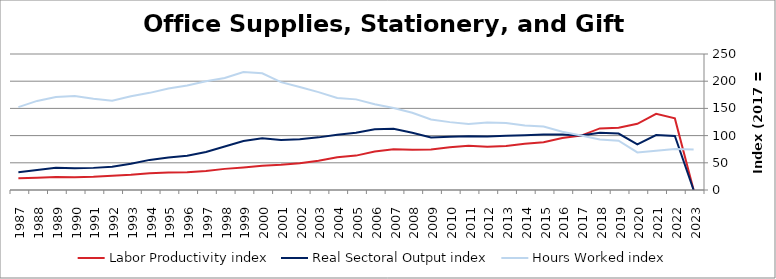
| Category | Labor Productivity index | Real Sectoral Output index | Hours Worked index |
|---|---|---|---|
| 2023.0 | 0 | 0 | 74.556 |
| 2022.0 | 131.637 | 99.237 | 75.387 |
| 2021.0 | 140.064 | 100.93 | 72.06 |
| 2020.0 | 121.677 | 83.976 | 69.015 |
| 2019.0 | 114.5 | 103.79 | 90.647 |
| 2018.0 | 113.265 | 105.143 | 92.829 |
| 2017.0 | 100 | 100 | 100 |
| 2016.0 | 95.387 | 102.232 | 107.176 |
| 2015.0 | 87.723 | 102.207 | 116.512 |
| 2014.0 | 85.18 | 100.848 | 118.394 |
| 2013.0 | 80.832 | 99.722 | 123.37 |
| 2012.0 | 79.314 | 98.306 | 123.944 |
| 2011.0 | 81.408 | 98.762 | 121.316 |
| 2010.0 | 78.515 | 97.969 | 124.777 |
| 2009.0 | 74.476 | 96.575 | 129.672 |
| 2008.0 | 74.041 | 105.225 | 142.116 |
| 2007.0 | 74.733 | 112.729 | 150.842 |
| 2006.0 | 70.94 | 111.759 | 157.539 |
| 2005.0 | 63.214 | 105.309 | 166.593 |
| 2004.0 | 60.124 | 101.686 | 169.127 |
| 2003.0 | 53.778 | 96.749 | 179.902 |
| 2002.0 | 49.362 | 93.495 | 189.408 |
| 2001.0 | 46.437 | 92.083 | 198.299 |
| 2000.0 | 44.388 | 95.247 | 214.579 |
| 1999.0 | 41.519 | 89.977 | 216.712 |
| 1998.0 | 38.832 | 80.014 | 206.053 |
| 1997.0 | 34.914 | 69.857 | 200.081 |
| 1996.0 | 32.709 | 62.878 | 192.236 |
| 1995.0 | 32.019 | 59.793 | 186.741 |
| 1994.0 | 30.993 | 55.346 | 178.574 |
| 1993.0 | 27.885 | 48.084 | 172.438 |
| 1992.0 | 26.031 | 42.752 | 164.232 |
| 1991.0 | 24.248 | 40.671 | 167.727 |
| 1990.0 | 23.248 | 40.206 | 172.942 |
| 1989.0 | 23.825 | 40.734 | 170.968 |
| 1988.0 | 22.415 | 36.705 | 163.752 |
| 1987.0 | 21.41 | 32.635 | 152.428 |